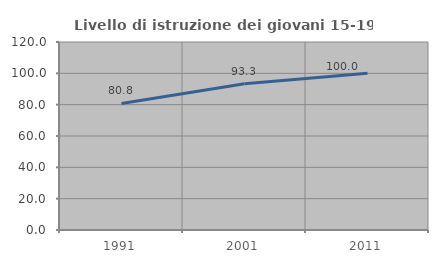
| Category | Livello di istruzione dei giovani 15-19 anni |
|---|---|
| 1991.0 | 80.769 |
| 2001.0 | 93.333 |
| 2011.0 | 100 |